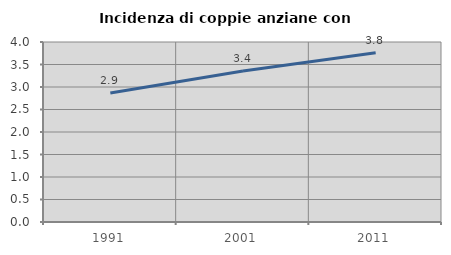
| Category | Incidenza di coppie anziane con figli |
|---|---|
| 1991.0 | 2.867 |
| 2001.0 | 3.357 |
| 2011.0 | 3.761 |